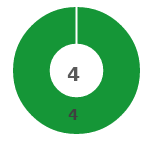
| Category | Series 0 |
|---|---|
| 0 | 4 |
| 1 | 0 |
| 2 | 0 |
| 3 | 0 |
| 4 | 0 |